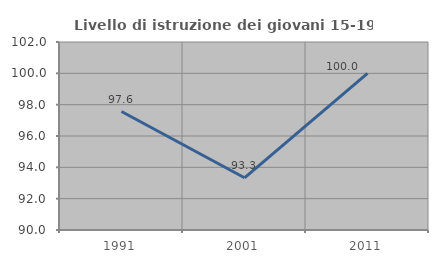
| Category | Livello di istruzione dei giovani 15-19 anni |
|---|---|
| 1991.0 | 97.561 |
| 2001.0 | 93.333 |
| 2011.0 | 100 |